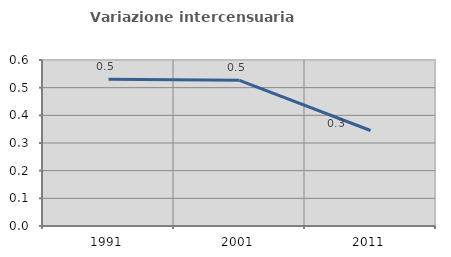
| Category | Variazione intercensuaria annua |
|---|---|
| 1991.0 | 0.53 |
| 2001.0 | 0.527 |
| 2011.0 | 0.345 |